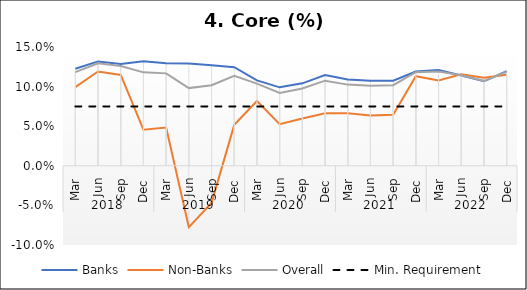
| Category | Banks | Non-Banks | Overall | Min. Requirement |
|---|---|---|---|---|
| 0 | 0.123 | 0.099 | 0.118 | 0.075 |
| 1 | 0.132 | 0.119 | 0.13 | 0.075 |
| 2 | 0.128 | 0.115 | 0.126 | 0.075 |
| 3 | 0.132 | 0.046 | 0.118 | 0.075 |
| 4 | 0.13 | 0.048 | 0.117 | 0.075 |
| 5 | 0.129 | -0.077 | 0.098 | 0.075 |
| 6 | 0.127 | -0.047 | 0.102 | 0.075 |
| 7 | 0.125 | 0.052 | 0.114 | 0.075 |
| 8 | 0.108 | 0.082 | 0.104 | 0.075 |
| 9 | 0.099 | 0.053 | 0.092 | 0.075 |
| 10 | 0.104 | 0.06 | 0.098 | 0.075 |
| 11 | 0.114 | 0.066 | 0.108 | 0.075 |
| 12 | 0.109 | 0.066 | 0.102 | 0.075 |
| 13 | 0.107 | 0.063 | 0.101 | 0.075 |
| 14 | 0.108 | 0.064 | 0.102 | 0.075 |
| 15 | 0.119 | 0.113 | 0.118 | 0.075 |
| 16 | 0.121 | 0.108 | 0.119 | 0.075 |
| 17 | 0.114 | 0.116 | 0.114 | 0.075 |
| 18 | 0.107 | 0.111 | 0.107 | 0.075 |
| 19 | 0.119 | 0.115 | 0.119 | 0.075 |